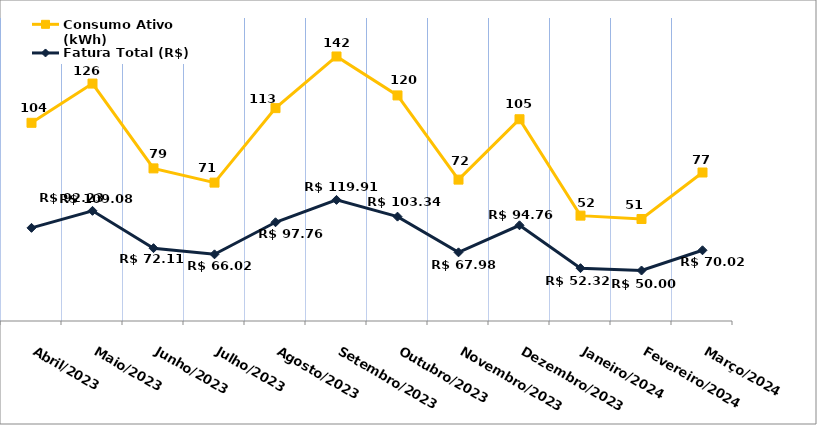
| Category | Fatura Total (R$) | Consumo Ativo (kWh) |
|---|---|---|
| Abril/2023 | 92.23 | 104 |
| Maio/2023 | 109.08 | 126 |
| Junho/2023 | 72.11 | 79 |
| Julho/2023 | 66.02 | 71 |
| Agosto/2023 | 97.76 | 113 |
| Setembro/2023 | 119.91 | 142 |
| Outubro/2023 | 103.34 | 120 |
| Novembro/2023 | 67.98 | 72 |
| Dezembro/2023 | 94.76 | 105 |
| Janeiro/2024 | 52.32 | 52 |
| Fevereiro/2024 | 50 | 51 |
| Março/2024 | 70.02 | 77 |